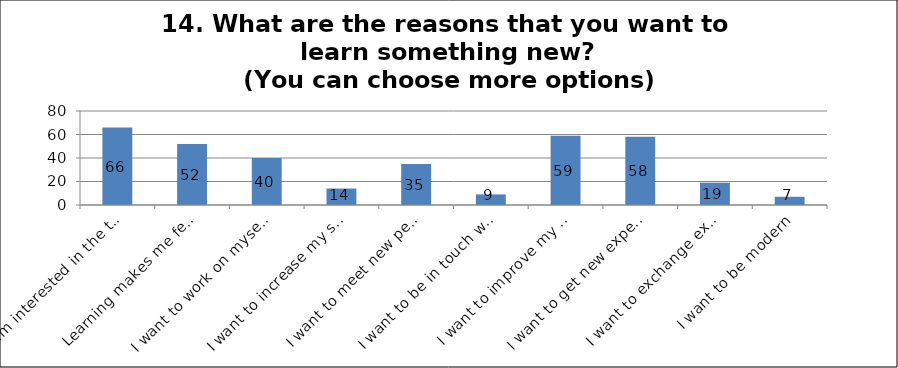
| Category | Series 0 |
|---|---|
| I am interested in the topic | 66 |
| Learning makes me feel satisfied | 52 |
| I want to work on myself | 40 |
| I want to increase my self-confidence | 14 |
| I want to meet new people irrespective of their age | 35 |
| I want to be in touch with the young generation | 9 |
| I want to improve my memory | 59 |
| I want to get new experiences and practice | 58 |
| I want to exchange experience | 19 |
| I want to be modern | 7 |